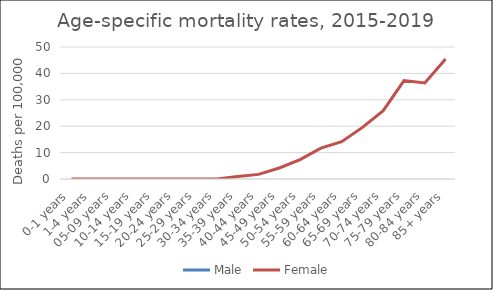
| Category | Male | Female |
|---|---|---|
| 0-1 years |  | 0 |
| 1-4 years |  | 0 |
| 05-09 years |  | 0 |
| 10-14 years |  | 0 |
| 15-19 years |  | 0 |
| 20-24 years |  | 0 |
| 25-29 years |  | 0 |
| 30-34 years |  | 0 |
| 35-39 years |  | 0.97 |
| 40-44 years |  | 1.75 |
| 45-49 years |  | 4.18 |
| 50-54 years |  | 7.37 |
| 55-59 years |  | 11.67 |
| 60-64 years |  | 14.12 |
| 65-69 years |  | 19.54 |
| 70-74 years |  | 25.9 |
| 75-79 years |  | 37.27 |
| 80-84 years |  | 36.36 |
| 85+ years |  | 45.47 |